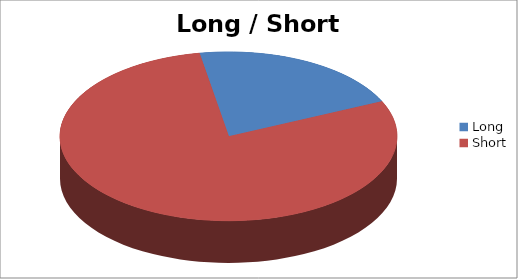
| Category | Long / Short Entries |
|---|---|
| Long | 9 |
| Short | 34 |